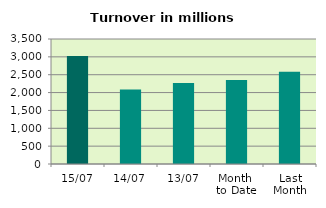
| Category | Series 0 |
|---|---|
| 15/07 | 3024.457 |
| 14/07 | 2086.449 |
| 13/07 | 2266.649 |
| Month 
to Date | 2355.329 |
| Last
Month | 2579.746 |